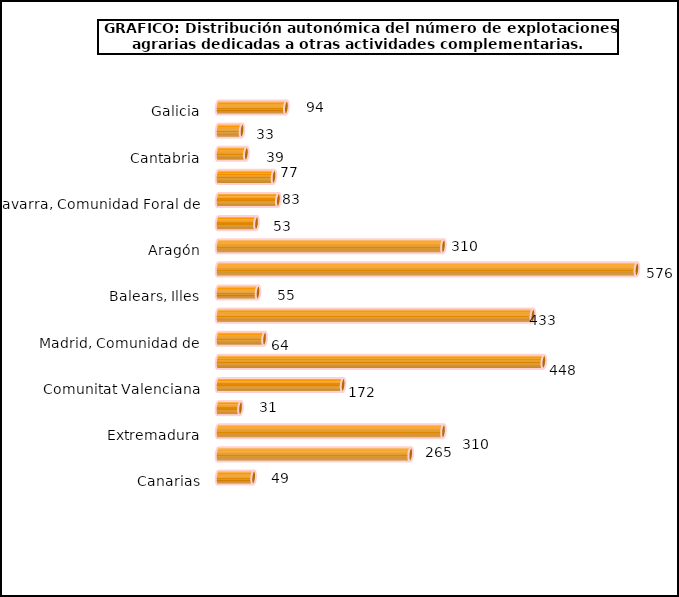
| Category | Series 0 |
|---|---|
| Galicia | 94 |
| Asturias, Principado de | 33 |
| Cantabria | 39 |
| País Vasco | 77 |
| Navarra, Comunidad Foral de | 83 |
| Rioja, La | 53 |
| Aragón | 310 |
| Cataluña | 576 |
| Balears, Illes | 55 |
| Castilla y León | 433 |
| Madrid, Comunidad de | 64 |
| Castilla - La Mancha | 448 |
| Comunitat Valenciana | 172 |
| Murcia, Región de | 31 |
| Extremadura | 310 |
| Andalucía | 265 |
| Canarias | 49 |